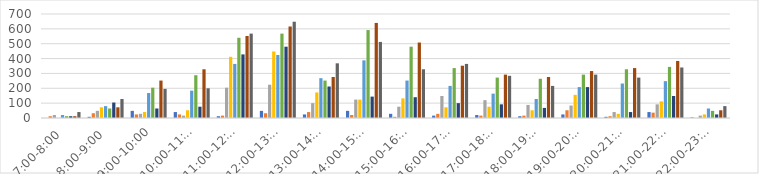
| Category | Series 0 | Series 1 | Series 2 | Series 3 | Series 4 | Series 5 | Series 6 | Series 7 | Series 8 |
|---|---|---|---|---|---|---|---|---|---|
| 7:00-8:00 | 0 | 12 | 20 | 0 | 20 | 12 | 12 | 12 | 40 |
| 8:00-9:00 | 8 | 32 | 48 | 72 | 80 | 64 | 104 | 72 | 128 |
| 9:00-10:00 | 48 | 24 | 28 | 40 | 168 | 204 | 64 | 252 | 196 |
| 10:00-11:00 | 40 | 24 | 16 | 52 | 184 | 288 | 76 | 328 | 200 |
| 11:00-12:00 | 12 | 16 | 204 | 412 | 364 | 540 | 428 | 552 | 568 |
| 12:00-13:00 | 48 | 32 | 224 | 448 | 424 | 568 | 480 | 616 | 648 |
| 13:00-14:00 | 24 | 40 | 100 | 172 | 268 | 252 | 212 | 276 | 368 |
| 14:00-15:00 | 48 | 20 | 124 | 124 | 388 | 592 | 144 | 640 | 512 |
| 15:00-16:00 | 28 | 8 | 76 | 132 | 252 | 480 | 140 | 508 | 328 |
| 16:00-17:00 | 16 | 28 | 148 | 72 | 216 | 336 | 100 | 352 | 364 |
| 17:00-18:00 | 20 | 16 | 120 | 76 | 164 | 272 | 92 | 292 | 284 |
| 18:00-19:00 | 12 | 16 | 88 | 52 | 128 | 264 | 68 | 276 | 216 |
| 19:00-20:00 | 24 | 52 | 84 | 156 | 208 | 292 | 208 | 316 | 292 |
| 20:00-21:00 | 8 | 12 | 40 | 28 | 232 | 328 | 40 | 336 | 272 |
| 21:00-22:00 | 40 | 36 | 92 | 112 | 248 | 344 | 148 | 384 | 340 |
| 22:00-23:00 | 4 | 0 | 16 | 24 | 64 | 48 | 24 | 52 | 80 |